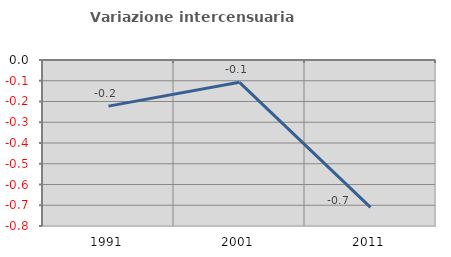
| Category | Variazione intercensuaria annua |
|---|---|
| 1991.0 | -0.222 |
| 2001.0 | -0.108 |
| 2011.0 | -0.71 |